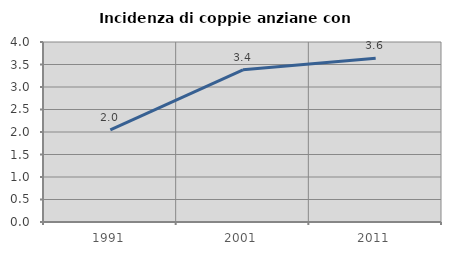
| Category | Incidenza di coppie anziane con figli |
|---|---|
| 1991.0 | 2.047 |
| 2001.0 | 3.382 |
| 2011.0 | 3.639 |